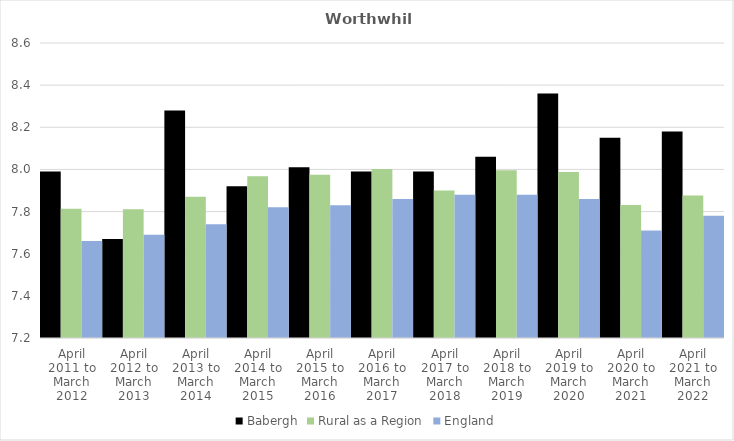
| Category | Babergh | Rural as a Region | England |
|---|---|---|---|
| April 2011 to March 2012 | 7.99 | 7.813 | 7.66 |
| April 2012 to March 2013 | 7.67 | 7.811 | 7.69 |
| April 2013 to March 2014 | 8.28 | 7.871 | 7.74 |
| April 2014 to March 2015 | 7.92 | 7.967 | 7.82 |
| April 2015 to March 2016 | 8.01 | 7.975 | 7.83 |
| April 2016 to March 2017 | 7.99 | 8.002 | 7.86 |
| April 2017 to March 2018 | 7.99 | 7.9 | 7.88 |
| April 2018 to March 2019 | 8.06 | 7.996 | 7.88 |
| April 2019 to March 2020 | 8.36 | 7.988 | 7.86 |
| April 2020 to March 2021 | 8.15 | 7.831 | 7.71 |
| April 2021 to March 2022 | 8.18 | 7.877 | 7.78 |